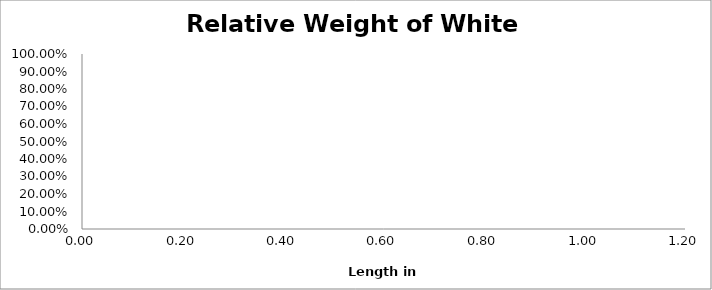
| Category | Relative Weight  |
|---|---|
|  | 0 |
|  | 0 |
|  | 0 |
|  | 0 |
|  | 0 |
|  | 0 |
|  | 0 |
|  | 0 |
|  | 0 |
|  | 0 |
|  | 0 |
|  | 0 |
|  | 0 |
|  | 0 |
|  | 0 |
|  | 0 |
|  | 0 |
|  | 0 |
|  | 0 |
|  | 0 |
|  | 0 |
|  | 0 |
|  | 0 |
|  | 0 |
|  | 0 |
|  | 0 |
|  | 0 |
|  | 0 |
|  | 0 |
|  | 0 |
|  | 0 |
|  | 0 |
|  | 0 |
|  | 0 |
|  | 0 |
|  | 0 |
|  | 0 |
|  | 0 |
|  | 0 |
|  | 0 |
|  | 0 |
|  | 0 |
|  | 0 |
|  | 0 |
|  | 0 |
|  | 0 |
|  | 0 |
|  | 0 |
|  | 0 |
|  | 0 |
|  | 0 |
|  | 0 |
|  | 0 |
|  | 0 |
|  | 0 |
|  | 0 |
|  | 0 |
|  | 0 |
|  | 0 |
|  | 0 |
|  | 0 |
|  | 0 |
|  | 0 |
|  | 0 |
|  | 0 |
|  | 0 |
|  | 0 |
|  | 0 |
|  | 0 |
|  | 0 |
|  | 0 |
|  | 0 |
|  | 0 |
|  | 0 |
|  | 0 |
|  | 0 |
|  | 0 |
|  | 0 |
|  | 0 |
|  | 0 |
|  | 0 |
|  | 0 |
|  | 0 |
|  | 0 |
|  | 0 |
|  | 0 |
|  | 0 |
|  | 0 |
|  | 0 |
|  | 0 |
|  | 0 |
|  | 0 |
|  | 0 |
|  | 0 |
|  | 0 |
|  | 0 |
|  | 0 |
|  | 0 |
|  | 0 |
|  | 0 |
|  | 0 |
|  | 0 |
|  | 0 |
|  | 0 |
|  | 0 |
|  | 0 |
|  | 0 |
|  | 0 |
|  | 0 |
|  | 0 |
|  | 0 |
|  | 0 |
|  | 0 |
|  | 0 |
|  | 0 |
|  | 0 |
|  | 0 |
|  | 0 |
|  | 0 |
|  | 0 |
|  | 0 |
|  | 0 |
|  | 0 |
|  | 0 |
|  | 0 |
|  | 0 |
|  | 0 |
|  | 0 |
|  | 0 |
|  | 0 |
|  | 0 |
|  | 0 |
|  | 0 |
|  | 0 |
|  | 0 |
|  | 0 |
|  | 0 |
|  | 0 |
|  | 0 |
|  | 0 |
|  | 0 |
|  | 0 |
|  | 0 |
|  | 0 |
|  | 0 |
|  | 0 |
|  | 0 |
|  | 0 |
|  | 0 |
|  | 0 |
|  | 0 |
|  | 0 |
|  | 0 |
|  | 0 |
|  | 0 |
|  | 0 |
|  | 0 |
|  | 0 |
|  | 0 |
|  | 0 |
|  | 0 |
|  | 0 |
|  | 0 |
|  | 0 |
|  | 0 |
|  | 0 |
|  | 0 |
|  | 0 |
|  | 0 |
|  | 0 |
|  | 0 |
|  | 0 |
|  | 0 |
|  | 0 |
|  | 0 |
|  | 0 |
|  | 0 |
|  | 0 |
|  | 0 |
|  | 0 |
|  | 0 |
|  | 0 |
|  | 0 |
|  | 0 |
|  | 0 |
|  | 0 |
|  | 0 |
|  | 0 |
|  | 0 |
|  | 0 |
|  | 0 |
|  | 0 |
|  | 0 |
|  | 0 |
|  | 0 |
|  | 0 |
|  | 0 |
|  | 0 |
|  | 0 |
|  | 0 |
|  | 0 |
|  | 0 |
|  | 0 |
|  | 0 |
|  | 0 |
|  | 0 |
|  | 0 |
|  | 0 |
|  | 0 |
|  | 0 |
|  | 0 |
|  | 0 |
|  | 0 |
|  | 0 |
|  | 0 |
|  | 0 |
|  | 0 |
|  | 0 |
|  | 0 |
|  | 0 |
|  | 0 |
|  | 0 |
|  | 0 |
|  | 0 |
|  | 0 |
|  | 0 |
|  | 0 |
|  | 0 |
|  | 0 |
|  | 0 |
|  | 0 |
|  | 0 |
|  | 0 |
|  | 0 |
|  | 0 |
|  | 0 |
|  | 0 |
|  | 0 |
|  | 0 |
|  | 0 |
|  | 0 |
|  | 0 |
|  | 0 |
|  | 0 |
|  | 0 |
|  | 0 |
|  | 0 |
|  | 0 |
|  | 0 |
|  | 0 |
|  | 0 |
|  | 0 |
|  | 0 |
|  | 0 |
|  | 0 |
|  | 0 |
|  | 0 |
|  | 0 |
|  | 0 |
|  | 0 |
|  | 0 |
|  | 0 |
|  | 0 |
|  | 0 |
|  | 0 |
|  | 0 |
|  | 0 |
|  | 0 |
|  | 0 |
|  | 0 |
|  | 0 |
|  | 0 |
|  | 0 |
|  | 0 |
|  | 0 |
|  | 0 |
|  | 0 |
|  | 0 |
|  | 0 |
|  | 0 |
|  | 0 |
|  | 0 |
|  | 0 |
|  | 0 |
|  | 0 |
|  | 0 |
|  | 0 |
|  | 0 |
|  | 0 |
|  | 0 |
|  | 0 |
|  | 0 |
|  | 0 |
|  | 0 |
|  | 0 |
|  | 0 |
|  | 0 |
|  | 0 |
|  | 0 |
|  | 0 |
|  | 0 |
|  | 0 |
|  | 0 |
|  | 0 |
|  | 0 |
|  | 0 |
|  | 0 |
|  | 0 |
|  | 0 |
|  | 0 |
|  | 0 |
|  | 0 |
|  | 0 |
|  | 0 |
|  | 0 |
|  | 0 |
|  | 0 |
|  | 0 |
|  | 0 |
|  | 0 |
|  | 0 |
|  | 0 |
|  | 0 |
|  | 0 |
|  | 0 |
|  | 0 |
|  | 0 |
|  | 0 |
|  | 0 |
|  | 0 |
|  | 0 |
|  | 0 |
|  | 0 |
|  | 0 |
|  | 0 |
|  | 0 |
|  | 0 |
|  | 0 |
|  | 0 |
|  | 0 |
|  | 0 |
|  | 0 |
|  | 0 |
|  | 0 |
|  | 0 |
|  | 0 |
|  | 0 |
|  | 0 |
|  | 0 |
|  | 0 |
|  | 0 |
|  | 0 |
|  | 0 |
|  | 0 |
|  | 0 |
|  | 0 |
|  | 0 |
|  | 0 |
|  | 0 |
|  | 0 |
|  | 0 |
|  | 0 |
|  | 0 |
|  | 0 |
|  | 0 |
|  | 0 |
|  | 0 |
|  | 0 |
|  | 0 |
|  | 0 |
|  | 0 |
|  | 0 |
|  | 0 |
|  | 0 |
|  | 0 |
|  | 0 |
|  | 0 |
|  | 0 |
|  | 0 |
|  | 0 |
|  | 0 |
|  | 0 |
|  | 0 |
|  | 0 |
|  | 0 |
|  | 0 |
|  | 0 |
|  | 0 |
|  | 0 |
|  | 0 |
|  | 0 |
|  | 0 |
|  | 0 |
|  | 0 |
|  | 0 |
|  | 0 |
|  | 0 |
|  | 0 |
|  | 0 |
|  | 0 |
|  | 0 |
|  | 0 |
|  | 0 |
|  | 0 |
|  | 0 |
|  | 0 |
|  | 0 |
|  | 0 |
|  | 0 |
|  | 0 |
|  | 0 |
|  | 0 |
|  | 0 |
|  | 0 |
|  | 0 |
|  | 0 |
|  | 0 |
|  | 0 |
|  | 0 |
|  | 0 |
|  | 0 |
|  | 0 |
|  | 0 |
|  | 0 |
|  | 0 |
|  | 0 |
|  | 0 |
|  | 0 |
|  | 0 |
|  | 0 |
|  | 0 |
|  | 0 |
|  | 0 |
|  | 0 |
|  | 0 |
|  | 0 |
|  | 0 |
|  | 0 |
|  | 0 |
|  | 0 |
|  | 0 |
|  | 0 |
|  | 0 |
|  | 0 |
|  | 0 |
|  | 0 |
|  | 0 |
|  | 0 |
|  | 0 |
|  | 0 |
|  | 0 |
|  | 0 |
|  | 0 |
|  | 0 |
|  | 0 |
|  | 0 |
|  | 0 |
|  | 0 |
|  | 0 |
|  | 0 |
|  | 0 |
|  | 0 |
|  | 0 |
|  | 0 |
|  | 0 |
|  | 0 |
|  | 0 |
|  | 0 |
|  | 0 |
|  | 0 |
|  | 0 |
|  | 0 |
|  | 0 |
|  | 0 |
|  | 0 |
|  | 0 |
|  | 0 |
|  | 0 |
|  | 0 |
|  | 0 |
|  | 0 |
|  | 0 |
|  | 0 |
|  | 0 |
|  | 0 |
|  | 0 |
|  | 0 |
|  | 0 |
|  | 0 |
|  | 0 |
|  | 0 |
|  | 0 |
|  | 0 |
|  | 0 |
|  | 0 |
|  | 0 |
|  | 0 |
|  | 0 |
|  | 0 |
|  | 0 |
|  | 0 |
|  | 0 |
|  | 0 |
|  | 0 |
|  | 0 |
|  | 0 |
|  | 0 |
|  | 0 |
|  | 0 |
|  | 0 |
|  | 0 |
|  | 0 |
|  | 0 |
|  | 0 |
|  | 0 |
|  | 0 |
|  | 0 |
|  | 0 |
|  | 0 |
|  | 0 |
|  | 0 |
|  | 0 |
|  | 0 |
|  | 0 |
|  | 0 |
|  | 0 |
|  | 0 |
|  | 0 |
|  | 0 |
|  | 0 |
|  | 0 |
|  | 0 |
|  | 0 |
|  | 0 |
|  | 0 |
|  | 0 |
|  | 0 |
|  | 0 |
|  | 0 |
|  | 0 |
|  | 0 |
|  | 0 |
|  | 0 |
|  | 0 |
|  | 0 |
|  | 0 |
|  | 0 |
|  | 0 |
|  | 0 |
|  | 0 |
|  | 0 |
|  | 0 |
|  | 0 |
|  | 0 |
|  | 0 |
|  | 0 |
|  | 0 |
|  | 0 |
|  | 0 |
|  | 0 |
|  | 0 |
|  | 0 |
|  | 0 |
|  | 0 |
|  | 0 |
|  | 0 |
|  | 0 |
|  | 0 |
|  | 0 |
|  | 0 |
|  | 0 |
|  | 0 |
|  | 0 |
|  | 0 |
|  | 0 |
|  | 0 |
|  | 0 |
|  | 0 |
|  | 0 |
|  | 0 |
|  | 0 |
|  | 0 |
|  | 0 |
|  | 0 |
|  | 0 |
|  | 0 |
|  | 0 |
|  | 0 |
|  | 0 |
|  | 0 |
|  | 0 |
|  | 0 |
|  | 0 |
|  | 0 |
|  | 0 |
|  | 0 |
|  | 0 |
|  | 0 |
|  | 0 |
|  | 0 |
|  | 0 |
|  | 0 |
|  | 0 |
|  | 0 |
|  | 0 |
|  | 0 |
|  | 0 |
|  | 0 |
|  | 0 |
|  | 0 |
|  | 0 |
|  | 0 |
|  | 0 |
|  | 0 |
|  | 0 |
|  | 0 |
|  | 0 |
|  | 0 |
|  | 0 |
|  | 0 |
|  | 0 |
|  | 0 |
|  | 0 |
|  | 0 |
|  | 0 |
|  | 0 |
|  | 0 |
|  | 0 |
|  | 0 |
|  | 0 |
|  | 0 |
|  | 0 |
|  | 0 |
|  | 0 |
|  | 0 |
|  | 0 |
|  | 0 |
|  | 0 |
|  | 0 |
|  | 0 |
|  | 0 |
|  | 0 |
|  | 0 |
|  | 0 |
|  | 0 |
|  | 0 |
|  | 0 |
|  | 0 |
|  | 0 |
|  | 0 |
|  | 0 |
|  | 0 |
|  | 0 |
|  | 0 |
|  | 0 |
|  | 0 |
|  | 0 |
|  | 0 |
|  | 0 |
|  | 0 |
|  | 0 |
|  | 0 |
|  | 0 |
|  | 0 |
|  | 0 |
|  | 0 |
|  | 0 |
|  | 0 |
|  | 0 |
|  | 0 |
|  | 0 |
|  | 0 |
|  | 0 |
|  | 0 |
|  | 0 |
|  | 0 |
|  | 0 |
|  | 0 |
|  | 0 |
|  | 0 |
|  | 0 |
|  | 0 |
|  | 0 |
|  | 0 |
|  | 0 |
|  | 0 |
|  | 0 |
|  | 0 |
|  | 0 |
|  | 0 |
|  | 0 |
|  | 0 |
|  | 0 |
|  | 0 |
|  | 0 |
|  | 0 |
|  | 0 |
|  | 0 |
|  | 0 |
|  | 0 |
|  | 0 |
|  | 0 |
|  | 0 |
|  | 0 |
|  | 0 |
|  | 0 |
|  | 0 |
|  | 0 |
|  | 0 |
|  | 0 |
|  | 0 |
|  | 0 |
|  | 0 |
|  | 0 |
|  | 0 |
|  | 0 |
|  | 0 |
|  | 0 |
|  | 0 |
|  | 0 |
|  | 0 |
|  | 0 |
|  | 0 |
|  | 0 |
|  | 0 |
|  | 0 |
|  | 0 |
|  | 0 |
|  | 0 |
|  | 0 |
|  | 0 |
|  | 0 |
|  | 0 |
|  | 0 |
|  | 0 |
|  | 0 |
|  | 0 |
|  | 0 |
|  | 0 |
|  | 0 |
|  | 0 |
|  | 0 |
|  | 0 |
|  | 0 |
|  | 0 |
|  | 0 |
|  | 0 |
|  | 0 |
|  | 0 |
|  | 0 |
|  | 0 |
|  | 0 |
|  | 0 |
|  | 0 |
|  | 0 |
|  | 0 |
|  | 0 |
|  | 0 |
|  | 0 |
|  | 0 |
|  | 0 |
|  | 0 |
|  | 0 |
|  | 0 |
|  | 0 |
|  | 0 |
|  | 0 |
|  | 0 |
|  | 0 |
|  | 0 |
|  | 0 |
|  | 0 |
|  | 0 |
|  | 0 |
|  | 0 |
|  | 0 |
|  | 0 |
|  | 0 |
|  | 0 |
|  | 0 |
|  | 0 |
|  | 0 |
|  | 0 |
|  | 0 |
|  | 0 |
|  | 0 |
|  | 0 |
|  | 0 |
|  | 0 |
|  | 0 |
|  | 0 |
|  | 0 |
|  | 0 |
|  | 0 |
|  | 0 |
|  | 0 |
|  | 0 |
|  | 0 |
|  | 0 |
|  | 0 |
|  | 0 |
|  | 0 |
|  | 0 |
|  | 0 |
|  | 0 |
|  | 0 |
|  | 0 |
|  | 0 |
|  | 0 |
|  | 0 |
|  | 0 |
|  | 0 |
|  | 0 |
|  | 0 |
|  | 0 |
|  | 0 |
|  | 0 |
|  | 0 |
|  | 0 |
|  | 0 |
|  | 0 |
|  | 0 |
|  | 0 |
|  | 0 |
|  | 0 |
|  | 0 |
|  | 0 |
|  | 0 |
|  | 0 |
|  | 0 |
|  | 0 |
|  | 0 |
|  | 0 |
|  | 0 |
|  | 0 |
|  | 0 |
|  | 0 |
|  | 0 |
|  | 0 |
|  | 0 |
|  | 0 |
|  | 0 |
|  | 0 |
|  | 0 |
|  | 0 |
|  | 0 |
|  | 0 |
|  | 0 |
|  | 0 |
|  | 0 |
|  | 0 |
|  | 0 |
|  | 0 |
|  | 0 |
|  | 0 |
|  | 0 |
|  | 0 |
|  | 0 |
|  | 0 |
|  | 0 |
|  | 0 |
|  | 0 |
|  | 0 |
|  | 0 |
|  | 0 |
|  | 0 |
|  | 0 |
|  | 0 |
|  | 0 |
|  | 0 |
|  | 0 |
|  | 0 |
|  | 0 |
|  | 0 |
|  | 0 |
|  | 0 |
|  | 0 |
|  | 0 |
|  | 0 |
|  | 0 |
|  | 0 |
|  | 0 |
|  | 0 |
|  | 0 |
|  | 0 |
|  | 0 |
|  | 0 |
|  | 0 |
|  | 0 |
|  | 0 |
|  | 0 |
|  | 0 |
|  | 0 |
|  | 0 |
|  | 0 |
|  | 0 |
|  | 0 |
|  | 0 |
|  | 0 |
|  | 0 |
|  | 0 |
|  | 0 |
|  | 0 |
|  | 0 |
|  | 0 |
|  | 0 |
|  | 0 |
|  | 0 |
|  | 0 |
|  | 0 |
|  | 0 |
|  | 0 |
|  | 0 |
|  | 0 |
|  | 0 |
|  | 0 |
|  | 0 |
|  | 0 |
|  | 0 |
|  | 0 |
|  | 0 |
|  | 0 |
|  | 0 |
|  | 0 |
|  | 0 |
|  | 0 |
|  | 0 |
|  | 0 |
|  | 0 |
|  | 0 |
|  | 0 |
|  | 0 |
|  | 0 |
|  | 0 |
|  | 0 |
|  | 0 |
|  | 0 |
|  | 0 |
|  | 0 |
|  | 0 |
|  | 0 |
|  | 0 |
|  | 0 |
|  | 0 |
|  | 0 |
|  | 0 |
|  | 0 |
|  | 0 |
|  | 0 |
|  | 0 |
|  | 0 |
|  | 0 |
|  | 0 |
|  | 0 |
|  | 0 |
|  | 0 |
|  | 0 |
|  | 0 |
|  | 0 |
|  | 0 |
|  | 0 |
|  | 0 |
|  | 0 |
|  | 0 |
|  | 0 |
|  | 0 |
|  | 0 |
|  | 0 |
|  | 0 |
|  | 0 |
|  | 0 |
|  | 0 |
|  | 0 |
|  | 0 |
|  | 0 |
|  | 0 |
|  | 0 |
|  | 0 |
|  | 0 |
|  | 0 |
|  | 0 |
|  | 0 |
|  | 0 |
|  | 0 |
|  | 0 |
|  | 0 |
|  | 0 |
|  | 0 |
|  | 0 |
|  | 0 |
|  | 0 |
|  | 0 |
|  | 0 |
|  | 0 |
|  | 0 |
|  | 0 |
|  | 0 |
|  | 0 |
|  | 0 |
|  | 0 |
|  | 0 |
|  | 0 |
|  | 0 |
|  | 0 |
|  | 0 |
|  | 0 |
|  | 0 |
|  | 0 |
|  | 0 |
|  | 0 |
|  | 0 |
|  | 0 |
|  | 0 |
|  | 0 |
|  | 0 |
|  | 0 |
|  | 0 |
|  | 0 |
|  | 0 |
|  | 0 |
|  | 0 |
|  | 0 |
|  | 0 |
|  | 0 |
|  | 0 |
|  | 0 |
|  | 0 |
|  | 0 |
|  | 0 |
|  | 0 |
|  | 0 |
|  | 0 |
|  | 0 |
|  | 0 |
|  | 0 |
|  | 0 |
|  | 0 |
|  | 0 |
|  | 0 |
|  | 0 |
|  | 0 |
|  | 0 |
|  | 0 |
|  | 0 |
|  | 0 |
|  | 0 |
|  | 0 |
|  | 0 |
|  | 0 |
|  | 0 |
|  | 0 |
|  | 0 |
|  | 0 |
|  | 0 |
|  | 0 |
|  | 0 |
|  | 0 |
|  | 0 |
|  | 0 |
|  | 0 |
|  | 0 |
|  | 0 |
|  | 0 |
|  | 0 |
|  | 0 |
|  | 0 |
|  | 0 |
|  | 0 |
|  | 0 |
|  | 0 |
|  | 0 |
|  | 0 |
|  | 0 |
|  | 0 |
|  | 0 |
|  | 0 |
|  | 0 |
|  | 0 |
|  | 0 |
|  | 0 |
|  | 0 |
|  | 0 |
|  | 0 |
|  | 0 |
|  | 0 |
|  | 0 |
|  | 0 |
|  | 0 |
|  | 0 |
|  | 0 |
|  | 0 |
|  | 0 |
|  | 0 |
|  | 0 |
|  | 0 |
|  | 0 |
|  | 0 |
|  | 0 |
|  | 0 |
|  | 0 |
|  | 0 |
|  | 0 |
|  | 0 |
|  | 0 |
|  | 0 |
|  | 0 |
|  | 0 |
|  | 0 |
|  | 0 |
|  | 0 |
|  | 0 |
|  | 0 |
|  | 0 |
|  | 0 |
|  | 0 |
|  | 0 |
|  | 0 |
|  | 0 |
|  | 0 |
|  | 0 |
|  | 0 |
|  | 0 |
|  | 0 |
|  | 0 |
|  | 0 |
|  | 0 |
|  | 0 |
|  | 0 |
|  | 0 |
|  | 0 |
|  | 0 |
|  | 0 |
|  | 0 |
|  | 0 |
|  | 0 |
|  | 0 |
|  | 0 |
|  | 0 |
|  | 0 |
|  | 0 |
|  | 0 |
|  | 0 |
|  | 0 |
|  | 0 |
|  | 0 |
|  | 0 |
|  | 0 |
|  | 0 |
|  | 0 |
|  | 0 |
|  | 0 |
|  | 0 |
|  | 0 |
|  | 0 |
|  | 0 |
|  | 0 |
|  | 0 |
|  | 0 |
|  | 0 |
|  | 0 |
|  | 0 |
|  | 0 |
|  | 0 |
|  | 0 |
|  | 0 |
|  | 0 |
|  | 0 |
|  | 0 |
|  | 0 |
|  | 0 |
|  | 0 |
|  | 0 |
|  | 0 |
|  | 0 |
|  | 0 |
|  | 0 |
|  | 0 |
|  | 0 |
|  | 0 |
|  | 0 |
|  | 0 |
|  | 0 |
|  | 0 |
|  | 0 |
|  | 0 |
|  | 0 |
|  | 0 |
|  | 0 |
|  | 0 |
|  | 0 |
|  | 0 |
|  | 0 |
|  | 0 |
|  | 0 |
|  | 0 |
|  | 0 |
|  | 0 |
|  | 0 |
|  | 0 |
|  | 0 |
|  | 0 |
|  | 0 |
|  | 0 |
|  | 0 |
|  | 0 |
|  | 0 |
|  | 0 |
|  | 0 |
|  | 0 |
|  | 0 |
|  | 0 |
|  | 0 |
|  | 0 |
|  | 0 |
|  | 0 |
|  | 0 |
|  | 0 |
|  | 0 |
|  | 0 |
|  | 0 |
|  | 0 |
|  | 0 |
|  | 0 |
|  | 0 |
|  | 0 |
|  | 0 |
|  | 0 |
|  | 0 |
|  | 0 |
|  | 0 |
|  | 0 |
|  | 0 |
|  | 0 |
|  | 0 |
|  | 0 |
|  | 0 |
|  | 0 |
|  | 0 |
|  | 0 |
|  | 0 |
|  | 0 |
|  | 0 |
|  | 0 |
|  | 0 |
|  | 0 |
|  | 0 |
|  | 0 |
|  | 0 |
|  | 0 |
|  | 0 |
|  | 0 |
|  | 0 |
|  | 0 |
|  | 0 |
|  | 0 |
|  | 0 |
|  | 0 |
|  | 0 |
|  | 0 |
|  | 0 |
|  | 0 |
|  | 0 |
|  | 0 |
|  | 0 |
|  | 0 |
|  | 0 |
|  | 0 |
|  | 0 |
|  | 0 |
|  | 0 |
|  | 0 |
|  | 0 |
|  | 0 |
|  | 0 |
|  | 0 |
|  | 0 |
|  | 0 |
|  | 0 |
|  | 0 |
|  | 0 |
|  | 0 |
|  | 0 |
|  | 0 |
|  | 0 |
|  | 0 |
|  | 0 |
|  | 0 |
|  | 0 |
|  | 0 |
|  | 0 |
|  | 0 |
|  | 0 |
|  | 0 |
|  | 0 |
|  | 0 |
|  | 0 |
|  | 0 |
|  | 0 |
|  | 0 |
|  | 0 |
|  | 0 |
|  | 0 |
|  | 0 |
|  | 0 |
|  | 0 |
|  | 0 |
|  | 0 |
|  | 0 |
|  | 0 |
|  | 0 |
|  | 0 |
|  | 0 |
|  | 0 |
|  | 0 |
|  | 0 |
|  | 0 |
|  | 0 |
|  | 0 |
|  | 0 |
|  | 0 |
|  | 0 |
|  | 0 |
|  | 0 |
|  | 0 |
|  | 0 |
|  | 0 |
|  | 0 |
|  | 0 |
|  | 0 |
|  | 0 |
|  | 0 |
|  | 0 |
|  | 0 |
|  | 0 |
|  | 0 |
|  | 0 |
|  | 0 |
|  | 0 |
|  | 0 |
|  | 0 |
|  | 0 |
|  | 0 |
|  | 0 |
|  | 0 |
|  | 0 |
|  | 0 |
|  | 0 |
|  | 0 |
|  | 0 |
|  | 0 |
|  | 0 |
|  | 0 |
|  | 0 |
|  | 0 |
|  | 0 |
|  | 0 |
|  | 0 |
|  | 0 |
|  | 0 |
|  | 0 |
|  | 0 |
|  | 0 |
|  | 0 |
|  | 0 |
|  | 0 |
|  | 0 |
|  | 0 |
|  | 0 |
|  | 0 |
|  | 0 |
|  | 0 |
|  | 0 |
|  | 0 |
|  | 0 |
|  | 0 |
|  | 0 |
|  | 0 |
|  | 0 |
|  | 0 |
|  | 0 |
|  | 0 |
|  | 0 |
|  | 0 |
|  | 0 |
|  | 0 |
|  | 0 |
|  | 0 |
|  | 0 |
|  | 0 |
|  | 0 |
|  | 0 |
|  | 0 |
|  | 0 |
|  | 0 |
|  | 0 |
|  | 0 |
|  | 0 |
|  | 0 |
|  | 0 |
|  | 0 |
|  | 0 |
|  | 0 |
|  | 0 |
|  | 0 |
|  | 0 |
|  | 0 |
|  | 0 |
|  | 0 |
|  | 0 |
|  | 0 |
|  | 0 |
|  | 0 |
|  | 0 |
|  | 0 |
|  | 0 |
|  | 0 |
|  | 0 |
|  | 0 |
|  | 0 |
|  | 0 |
|  | 0 |
|  | 0 |
|  | 0 |
|  | 0 |
|  | 0 |
|  | 0 |
|  | 0 |
|  | 0 |
|  | 0 |
|  | 0 |
|  | 0 |
|  | 0 |
|  | 0 |
|  | 0 |
|  | 0 |
|  | 0 |
|  | 0 |
|  | 0 |
|  | 0 |
|  | 0 |
|  | 0 |
|  | 0 |
|  | 0 |
|  | 0 |
|  | 0 |
|  | 0 |
|  | 0 |
|  | 0 |
|  | 0 |
|  | 0 |
|  | 0 |
|  | 0 |
|  | 0 |
|  | 0 |
|  | 0 |
|  | 0 |
|  | 0 |
|  | 0 |
|  | 0 |
|  | 0 |
|  | 0 |
|  | 0 |
|  | 0 |
|  | 0 |
|  | 0 |
|  | 0 |
|  | 0 |
|  | 0 |
|  | 0 |
|  | 0 |
|  | 0 |
|  | 0 |
|  | 0 |
|  | 0 |
|  | 0 |
|  | 0 |
|  | 0 |
|  | 0 |
|  | 0 |
|  | 0 |
|  | 0 |
|  | 0 |
|  | 0 |
|  | 0 |
|  | 0 |
|  | 0 |
|  | 0 |
|  | 0 |
|  | 0 |
|  | 0 |
|  | 0 |
|  | 0 |
|  | 0 |
|  | 0 |
|  | 0 |
|  | 0 |
|  | 0 |
|  | 0 |
|  | 0 |
|  | 0 |
|  | 0 |
|  | 0 |
|  | 0 |
|  | 0 |
|  | 0 |
|  | 0 |
|  | 0 |
|  | 0 |
|  | 0 |
|  | 0 |
|  | 0 |
|  | 0 |
|  | 0 |
|  | 0 |
|  | 0 |
|  | 0 |
|  | 0 |
|  | 0 |
|  | 0 |
|  | 0 |
|  | 0 |
|  | 0 |
|  | 0 |
|  | 0 |
|  | 0 |
|  | 0 |
|  | 0 |
|  | 0 |
|  | 0 |
|  | 0 |
|  | 0 |
|  | 0 |
|  | 0 |
|  | 0 |
|  | 0 |
|  | 0 |
|  | 0 |
|  | 0 |
|  | 0 |
|  | 0 |
|  | 0 |
|  | 0 |
|  | 0 |
|  | 0 |
|  | 0 |
|  | 0 |
|  | 0 |
|  | 0 |
|  | 0 |
|  | 0 |
|  | 0 |
|  | 0 |
|  | 0 |
|  | 0 |
|  | 0 |
|  | 0 |
|  | 0 |
|  | 0 |
|  | 0 |
|  | 0 |
|  | 0 |
|  | 0 |
|  | 0 |
|  | 0 |
|  | 0 |
|  | 0 |
|  | 0 |
|  | 0 |
|  | 0 |
|  | 0 |
|  | 0 |
|  | 0 |
|  | 0 |
|  | 0 |
|  | 0 |
|  | 0 |
|  | 0 |
|  | 0 |
|  | 0 |
|  | 0 |
|  | 0 |
|  | 0 |
|  | 0 |
|  | 0 |
|  | 0 |
|  | 0 |
|  | 0 |
|  | 0 |
|  | 0 |
|  | 0 |
|  | 0 |
|  | 0 |
|  | 0 |
|  | 0 |
|  | 0 |
|  | 0 |
|  | 0 |
|  | 0 |
|  | 0 |
|  | 0 |
|  | 0 |
|  | 0 |
|  | 0 |
|  | 0 |
|  | 0 |
|  | 0 |
|  | 0 |
|  | 0 |
|  | 0 |
|  | 0 |
|  | 0 |
|  | 0 |
|  | 0 |
|  | 0 |
|  | 0 |
|  | 0 |
|  | 0 |
|  | 0 |
|  | 0 |
|  | 0 |
|  | 0 |
|  | 0 |
|  | 0 |
|  | 0 |
|  | 0 |
|  | 0 |
|  | 0 |
|  | 0 |
|  | 0 |
|  | 0 |
|  | 0 |
|  | 0 |
|  | 0 |
|  | 0 |
|  | 0 |
|  | 0 |
|  | 0 |
|  | 0 |
|  | 0 |
|  | 0 |
|  | 0 |
|  | 0 |
|  | 0 |
|  | 0 |
|  | 0 |
|  | 0 |
|  | 0 |
|  | 0 |
|  | 0 |
|  | 0 |
|  | 0 |
|  | 0 |
|  | 0 |
|  | 0 |
|  | 0 |
|  | 0 |
|  | 0 |
|  | 0 |
|  | 0 |
|  | 0 |
|  | 0 |
|  | 0 |
|  | 0 |
|  | 0 |
|  | 0 |
|  | 0 |
|  | 0 |
|  | 0 |
|  | 0 |
|  | 0 |
|  | 0 |
|  | 0 |
|  | 0 |
|  | 0 |
|  | 0 |
|  | 0 |
|  | 0 |
|  | 0 |
|  | 0 |
|  | 0 |
|  | 0 |
|  | 0 |
|  | 0 |
|  | 0 |
|  | 0 |
|  | 0 |
|  | 0 |
|  | 0 |
|  | 0 |
|  | 0 |
|  | 0 |
|  | 0 |
|  | 0 |
|  | 0 |
|  | 0 |
|  | 0 |
|  | 0 |
|  | 0 |
|  | 0 |
|  | 0 |
|  | 0 |
|  | 0 |
|  | 0 |
|  | 0 |
|  | 0 |
|  | 0 |
|  | 0 |
|  | 0 |
|  | 0 |
|  | 0 |
|  | 0 |
|  | 0 |
|  | 0 |
|  | 0 |
|  | 0 |
|  | 0 |
|  | 0 |
|  | 0 |
|  | 0 |
|  | 0 |
|  | 0 |
|  | 0 |
|  | 0 |
|  | 0 |
|  | 0 |
|  | 0 |
|  | 0 |
|  | 0 |
|  | 0 |
|  | 0 |
|  | 0 |
|  | 0 |
|  | 0 |
|  | 0 |
|  | 0 |
|  | 0 |
|  | 0 |
|  | 0 |
|  | 0 |
|  | 0 |
|  | 0 |
|  | 0 |
|  | 0 |
|  | 0 |
|  | 0 |
|  | 0 |
|  | 0 |
|  | 0 |
|  | 0 |
|  | 0 |
|  | 0 |
|  | 0 |
|  | 0 |
|  | 0 |
|  | 0 |
|  | 0 |
|  | 0 |
|  | 0 |
|  | 0 |
|  | 0 |
|  | 0 |
|  | 0 |
|  | 0 |
|  | 0 |
|  | 0 |
|  | 0 |
|  | 0 |
|  | 0 |
|  | 0 |
|  | 0 |
|  | 0 |
|  | 0 |
|  | 0 |
|  | 0 |
|  | 0 |
|  | 0 |
|  | 0 |
|  | 0 |
|  | 0 |
|  | 0 |
|  | 0 |
|  | 0 |
|  | 0 |
|  | 0 |
|  | 0 |
|  | 0 |
|  | 0 |
|  | 0 |
|  | 0 |
|  | 0 |
|  | 0 |
|  | 0 |
|  | 0 |
|  | 0 |
|  | 0 |
|  | 0 |
|  | 0 |
|  | 0 |
|  | 0 |
|  | 0 |
|  | 0 |
|  | 0 |
|  | 0 |
|  | 0 |
|  | 0 |
|  | 0 |
|  | 0 |
|  | 0 |
|  | 0 |
|  | 0 |
|  | 0 |
|  | 0 |
|  | 0 |
|  | 0 |
|  | 0 |
|  | 0 |
|  | 0 |
|  | 0 |
|  | 0 |
|  | 0 |
|  | 0 |
|  | 0 |
|  | 0 |
|  | 0 |
|  | 0 |
|  | 0 |
|  | 0 |
|  | 0 |
|  | 0 |
|  | 0 |
|  | 0 |
|  | 0 |
|  | 0 |
|  | 0 |
|  | 0 |
|  | 0 |
|  | 0 |
|  | 0 |
|  | 0 |
|  | 0 |
|  | 0 |
|  | 0 |
|  | 0 |
|  | 0 |
|  | 0 |
|  | 0 |
|  | 0 |
|  | 0 |
|  | 0 |
|  | 0 |
|  | 0 |
|  | 0 |
|  | 0 |
|  | 0 |
|  | 0 |
|  | 0 |
|  | 0 |
|  | 0 |
|  | 0 |
|  | 0 |
|  | 0 |
|  | 0 |
|  | 0 |
|  | 0 |
|  | 0 |
|  | 0 |
|  | 0 |
|  | 0 |
|  | 0 |
|  | 0 |
|  | 0 |
|  | 0 |
|  | 0 |
|  | 0 |
|  | 0 |
|  | 0 |
|  | 0 |
|  | 0 |
|  | 0 |
|  | 0 |
|  | 0 |
|  | 0 |
|  | 0 |
|  | 0 |
|  | 0 |
|  | 0 |
|  | 0 |
|  | 0 |
|  | 0 |
|  | 0 |
|  | 0 |
|  | 0 |
|  | 0 |
|  | 0 |
|  | 0 |
|  | 0 |
|  | 0 |
|  | 0 |
|  | 0 |
|  | 0 |
|  | 0 |
|  | 0 |
|  | 0 |
|  | 0 |
|  | 0 |
|  | 0 |
|  | 0 |
|  | 0 |
|  | 0 |
|  | 0 |
|  | 0 |
|  | 0 |
|  | 0 |
|  | 0 |
|  | 0 |
|  | 0 |
|  | 0 |
|  | 0 |
|  | 0 |
|  | 0 |
|  | 0 |
|  | 0 |
|  | 0 |
|  | 0 |
|  | 0 |
|  | 0 |
|  | 0 |
|  | 0 |
|  | 0 |
|  | 0 |
|  | 0 |
|  | 0 |
|  | 0 |
|  | 0 |
|  | 0 |
|  | 0 |
|  | 0 |
|  | 0 |
|  | 0 |
|  | 0 |
|  | 0 |
|  | 0 |
|  | 0 |
|  | 0 |
|  | 0 |
|  | 0 |
|  | 0 |
|  | 0 |
|  | 0 |
|  | 0 |
|  | 0 |
|  | 0 |
|  | 0 |
|  | 0 |
|  | 0 |
|  | 0 |
|  | 0 |
|  | 0 |
|  | 0 |
|  | 0 |
|  | 0 |
|  | 0 |
|  | 0 |
|  | 0 |
|  | 0 |
|  | 0 |
|  | 0 |
|  | 0 |
|  | 0 |
|  | 0 |
|  | 0 |
|  | 0 |
|  | 0 |
|  | 0 |
|  | 0 |
|  | 0 |
|  | 0 |
|  | 0 |
|  | 0 |
|  | 0 |
|  | 0 |
|  | 0 |
|  | 0 |
|  | 0 |
|  | 0 |
|  | 0 |
|  | 0 |
|  | 0 |
|  | 0 |
|  | 0 |
|  | 0 |
|  | 0 |
|  | 0 |
|  | 0 |
|  | 0 |
|  | 0 |
|  | 0 |
|  | 0 |
|  | 0 |
|  | 0 |
|  | 0 |
|  | 0 |
|  | 0 |
|  | 0 |
|  | 0 |
|  | 0 |
|  | 0 |
|  | 0 |
|  | 0 |
|  | 0 |
|  | 0 |
|  | 0 |
|  | 0 |
|  | 0 |
|  | 0 |
|  | 0 |
|  | 0 |
|  | 0 |
|  | 0 |
|  | 0 |
|  | 0 |
|  | 0 |
|  | 0 |
|  | 0 |
|  | 0 |
|  | 0 |
|  | 0 |
|  | 0 |
|  | 0 |
|  | 0 |
|  | 0 |
|  | 0 |
|  | 0 |
|  | 0 |
|  | 0 |
|  | 0 |
|  | 0 |
|  | 0 |
|  | 0 |
|  | 0 |
|  | 0 |
|  | 0 |
|  | 0 |
|  | 0 |
|  | 0 |
|  | 0 |
|  | 0 |
|  | 0 |
|  | 0 |
|  | 0 |
|  | 0 |
|  | 0 |
|  | 0 |
|  | 0 |
|  | 0 |
|  | 0 |
|  | 0 |
|  | 0 |
|  | 0 |
|  | 0 |
|  | 0 |
|  | 0 |
|  | 0 |
|  | 0 |
|  | 0 |
|  | 0 |
|  | 0 |
|  | 0 |
|  | 0 |
|  | 0 |
|  | 0 |
|  | 0 |
|  | 0 |
|  | 0 |
|  | 0 |
|  | 0 |
|  | 0 |
|  | 0 |
|  | 0 |
|  | 0 |
|  | 0 |
|  | 0 |
|  | 0 |
|  | 0 |
|  | 0 |
|  | 0 |
|  | 0 |
|  | 0 |
|  | 0 |
|  | 0 |
|  | 0 |
|  | 0 |
|  | 0 |
|  | 0 |
|  | 0 |
|  | 0 |
|  | 0 |
|  | 0 |
|  | 0 |
|  | 0 |
|  | 0 |
|  | 0 |
|  | 0 |
|  | 0 |
|  | 0 |
|  | 0 |
|  | 0 |
|  | 0 |
|  | 0 |
|  | 0 |
|  | 0 |
|  | 0 |
|  | 0 |
|  | 0 |
|  | 0 |
|  | 0 |
|  | 0 |
|  | 0 |
|  | 0 |
|  | 0 |
|  | 0 |
|  | 0 |
|  | 0 |
|  | 0 |
|  | 0 |
|  | 0 |
|  | 0 |
|  | 0 |
|  | 0 |
|  | 0 |
|  | 0 |
|  | 0 |
|  | 0 |
|  | 0 |
|  | 0 |
|  | 0 |
|  | 0 |
|  | 0 |
|  | 0 |
|  | 0 |
|  | 0 |
|  | 0 |
|  | 0 |
|  | 0 |
|  | 0 |
|  | 0 |
|  | 0 |
|  | 0 |
|  | 0 |
|  | 0 |
|  | 0 |
|  | 0 |
|  | 0 |
|  | 0 |
|  | 0 |
|  | 0 |
|  | 0 |
|  | 0 |
|  | 0 |
|  | 0 |
|  | 0 |
|  | 0 |
|  | 0 |
|  | 0 |
|  | 0 |
|  | 0 |
|  | 0 |
|  | 0 |
|  | 0 |
|  | 0 |
|  | 0 |
|  | 0 |
|  | 0 |
|  | 0 |
|  | 0 |
|  | 0 |
|  | 0 |
|  | 0 |
|  | 0 |
|  | 0 |
|  | 0 |
|  | 0 |
|  | 0 |
|  | 0 |
|  | 0 |
|  | 0 |
|  | 0 |
|  | 0 |
|  | 0 |
|  | 0 |
|  | 0 |
|  | 0 |
|  | 0 |
|  | 0 |
|  | 0 |
|  | 0 |
|  | 0 |
|  | 0 |
|  | 0 |
|  | 0 |
|  | 0 |
|  | 0 |
|  | 0 |
|  | 0 |
|  | 0 |
|  | 0 |
|  | 0 |
|  | 0 |
|  | 0 |
|  | 0 |
|  | 0 |
|  | 0 |
|  | 0 |
|  | 0 |
|  | 0 |
|  | 0 |
|  | 0 |
|  | 0 |
|  | 0 |
|  | 0 |
|  | 0 |
|  | 0 |
|  | 0 |
|  | 0 |
|  | 0 |
|  | 0 |
|  | 0 |
|  | 0 |
|  | 0 |
|  | 0 |
|  | 0 |
|  | 0 |
|  | 0 |
|  | 0 |
|  | 0 |
|  | 0 |
|  | 0 |
|  | 0 |
|  | 0 |
|  | 0 |
|  | 0 |
|  | 0 |
|  | 0 |
|  | 0 |
|  | 0 |
|  | 0 |
|  | 0 |
|  | 0 |
|  | 0 |
|  | 0 |
|  | 0 |
|  | 0 |
|  | 0 |
|  | 0 |
|  | 0 |
|  | 0 |
|  | 0 |
|  | 0 |
|  | 0 |
|  | 0 |
|  | 0 |
|  | 0 |
|  | 0 |
|  | 0 |
|  | 0 |
|  | 0 |
|  | 0 |
|  | 0 |
|  | 0 |
|  | 0 |
|  | 0 |
|  | 0 |
|  | 0 |
|  | 0 |
|  | 0 |
|  | 0 |
|  | 0 |
|  | 0 |
|  | 0 |
|  | 0 |
|  | 0 |
|  | 0 |
|  | 0 |
|  | 0 |
|  | 0 |
|  | 0 |
|  | 0 |
|  | 0 |
|  | 0 |
|  | 0 |
|  | 0 |
|  | 0 |
|  | 0 |
|  | 0 |
|  | 0 |
|  | 0 |
|  | 0 |
|  | 0 |
|  | 0 |
|  | 0 |
|  | 0 |
|  | 0 |
|  | 0 |
|  | 0 |
|  | 0 |
|  | 0 |
|  | 0 |
|  | 0 |
|  | 0 |
|  | 0 |
|  | 0 |
|  | 0 |
|  | 0 |
|  | 0 |
|  | 0 |
|  | 0 |
|  | 0 |
|  | 0 |
|  | 0 |
|  | 0 |
|  | 0 |
|  | 0 |
|  | 0 |
|  | 0 |
|  | 0 |
|  | 0 |
|  | 0 |
|  | 0 |
|  | 0 |
|  | 0 |
|  | 0 |
|  | 0 |
|  | 0 |
|  | 0 |
|  | 0 |
|  | 0 |
|  | 0 |
|  | 0 |
|  | 0 |
|  | 0 |
|  | 0 |
|  | 0 |
|  | 0 |
|  | 0 |
|  | 0 |
|  | 0 |
|  | 0 |
|  | 0 |
|  | 0 |
|  | 0 |
|  | 0 |
|  | 0 |
|  | 0 |
|  | 0 |
|  | 0 |
|  | 0 |
|  | 0 |
|  | 0 |
|  | 0 |
|  | 0 |
|  | 0 |
|  | 0 |
|  | 0 |
|  | 0 |
|  | 0 |
|  | 0 |
|  | 0 |
|  | 0 |
|  | 0 |
|  | 0 |
|  | 0 |
|  | 0 |
|  | 0 |
|  | 0 |
|  | 0 |
|  | 0 |
|  | 0 |
|  | 0 |
|  | 0 |
|  | 0 |
|  | 0 |
|  | 0 |
|  | 0 |
|  | 0 |
|  | 0 |
|  | 0 |
|  | 0 |
|  | 0 |
|  | 0 |
|  | 0 |
|  | 0 |
|  | 0 |
|  | 0 |
|  | 0 |
|  | 0 |
|  | 0 |
|  | 0 |
|  | 0 |
|  | 0 |
|  | 0 |
|  | 0 |
|  | 0 |
|  | 0 |
|  | 0 |
|  | 0 |
|  | 0 |
|  | 0 |
|  | 0 |
|  | 0 |
|  | 0 |
|  | 0 |
|  | 0 |
|  | 0 |
|  | 0 |
|  | 0 |
|  | 0 |
|  | 0 |
|  | 0 |
|  | 0 |
|  | 0 |
|  | 0 |
|  | 0 |
|  | 0 |
|  | 0 |
|  | 0 |
|  | 0 |
|  | 0 |
|  | 0 |
|  | 0 |
|  | 0 |
|  | 0 |
|  | 0 |
|  | 0 |
|  | 0 |
|  | 0 |
|  | 0 |
|  | 0 |
|  | 0 |
|  | 0 |
|  | 0 |
|  | 0 |
|  | 0 |
|  | 0 |
|  | 0 |
|  | 0 |
|  | 0 |
|  | 0 |
|  | 0 |
|  | 0 |
|  | 0 |
|  | 0 |
|  | 0 |
|  | 0 |
|  | 0 |
|  | 0 |
|  | 0 |
|  | 0 |
|  | 0 |
|  | 0 |
|  | 0 |
|  | 0 |
|  | 0 |
|  | 0 |
|  | 0 |
|  | 0 |
|  | 0 |
|  | 0 |
|  | 0 |
|  | 0 |
|  | 0 |
|  | 0 |
|  | 0 |
|  | 0 |
|  | 0 |
|  | 0 |
|  | 0 |
|  | 0 |
|  | 0 |
|  | 0 |
|  | 0 |
|  | 0 |
|  | 0 |
|  | 0 |
|  | 0 |
|  | 0 |
|  | 0 |
|  | 0 |
|  | 0 |
|  | 0 |
|  | 0 |
|  | 0 |
|  | 0 |
|  | 0 |
|  | 0 |
|  | 0 |
|  | 0 |
|  | 0 |
|  | 0 |